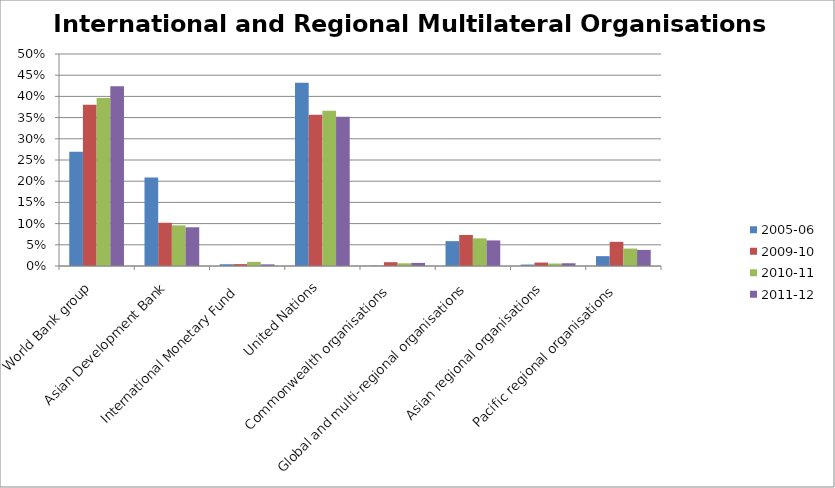
| Category | 2005-06 | 2009-10 | 2010-11 | 2011-12 |
|---|---|---|---|---|
| World Bank group | 0.269 | 0.38 | 0.396 | 0.424 |
| Asian Development Bank  | 0.209 | 0.102 | 0.096 | 0.091 |
| International Monetary Fund  | 0.004 | 0.004 | 0.01 | 0.004 |
| United Nations  | 0.432 | 0.356 | 0.366 | 0.352 |
| Commonwealth organisations  | 0.001 | 0.009 | 0.006 | 0.007 |
| Global and multi-regional organisations | 0.059 | 0.073 | 0.065 | 0.06 |
| Asian regional organisations | 0.003 | 0.008 | 0.006 | 0.006 |
| Pacific regional organisations  | 0.023 | 0.057 | 0.041 | 0.038 |